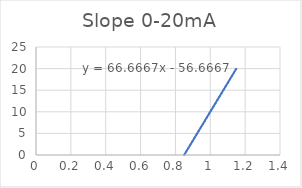
| Category | Series 0 |
|---|---|
| 0.85 | 0 |
| 1.15 | 20 |